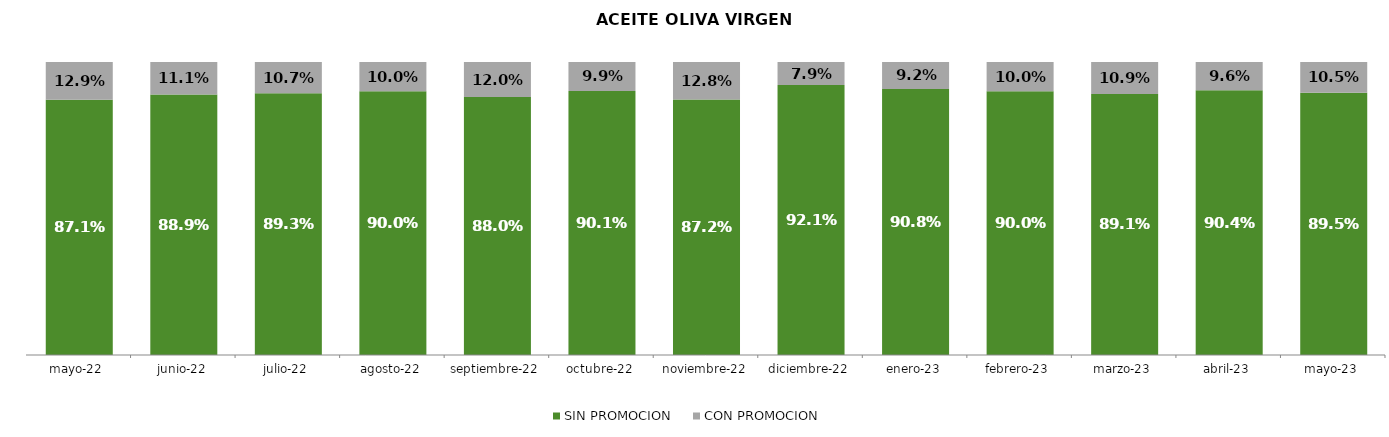
| Category | SIN PROMOCION   | CON PROMOCION   |
|---|---|---|
| 2022-05-01 | 0.871 | 0.129 |
| 2022-06-01 | 0.889 | 0.111 |
| 2022-07-01 | 0.893 | 0.107 |
| 2022-08-01 | 0.9 | 0.1 |
| 2022-09-01 | 0.88 | 0.12 |
| 2022-10-01 | 0.901 | 0.099 |
| 2022-11-01 | 0.872 | 0.128 |
| 2022-12-01 | 0.921 | 0.079 |
| 2023-01-01 | 0.908 | 0.092 |
| 2023-02-01 | 0.9 | 0.1 |
| 2023-03-01 | 0.891 | 0.109 |
| 2023-04-01 | 0.904 | 0.096 |
| 2023-05-01 | 0.895 | 0.105 |